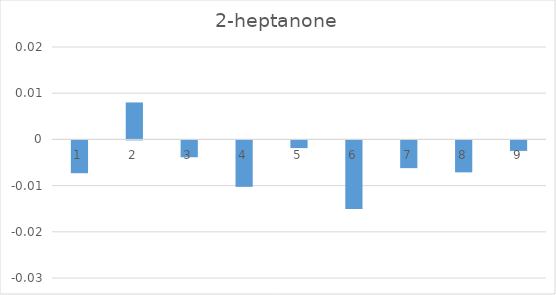
| Category | Series 0 |
|---|---|
| 0 | -0.007 |
| 1 | 0.008 |
| 2 | -0.004 |
| 3 | -0.01 |
| 4 | -0.002 |
| 5 | -0.015 |
| 6 | -0.006 |
| 7 | -0.007 |
| 8 | -0.002 |